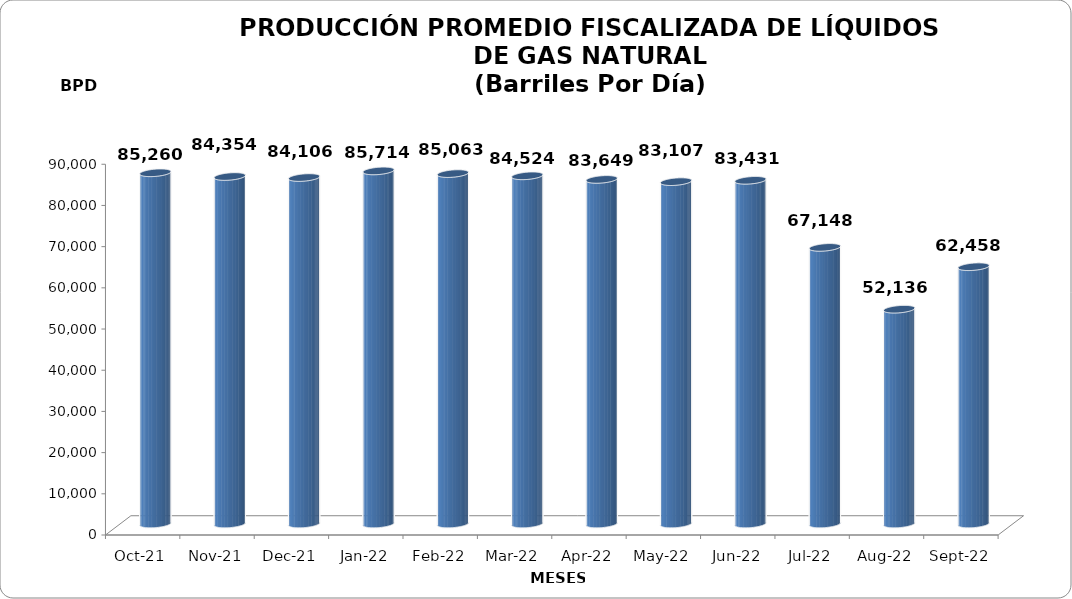
| Category | Series 0 |
|---|---|
| 2021-10-01 | 85260 |
| 2021-11-01 | 84354 |
| 2021-12-01 | 84106 |
| 2022-01-01 | 85714.355 |
| 2022-02-01 | 85063 |
| 2022-03-01 | 84523.548 |
| 2022-04-01 | 83649 |
| 2022-05-01 | 83107.387 |
| 2022-06-01 | 83430.867 |
| 2022-07-01 | 67147.806 |
| 2022-08-01 | 52135.548 |
| 2022-09-01 | 62458.2 |